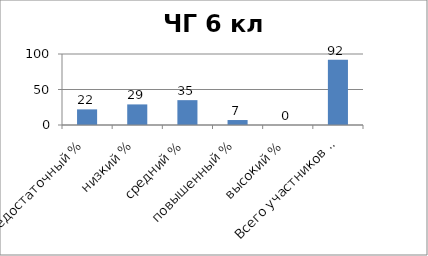
| Category | Series 0 |
|---|---|
| недостаточный % | 22 |
| низкий % | 29 |
| средний % | 35 |
| повышенный % | 7 |
| высокий % | 0 |
| Всего участников % | 92 |